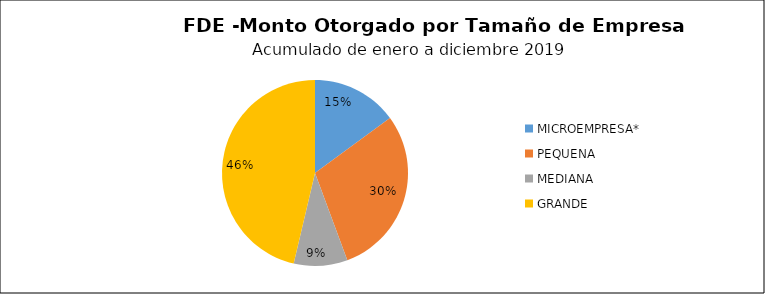
| Category | Monto | Créditos |
|---|---|---|
| MICROEMPRESA* | 2.419 | 176 |
| PEQUENA | 4.771 | 64 |
| MEDIANA | 1.513 | 6 |
| GRANDE | 7.508 | 5 |